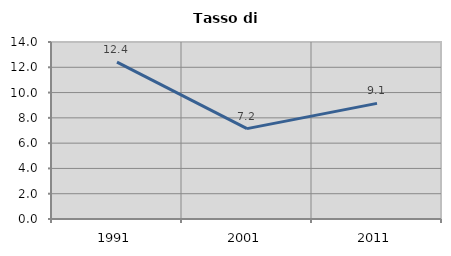
| Category | Tasso di disoccupazione   |
|---|---|
| 1991.0 | 12.402 |
| 2001.0 | 7.15 |
| 2011.0 | 9.146 |